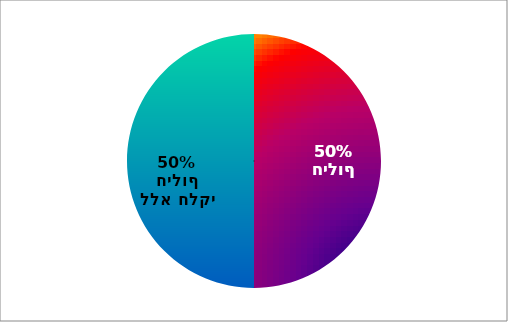
| Category | Series 0 |
|---|---|
| חלקי חילוף | 4 |
| תיקונים ללא חלקי חילוף | 4 |